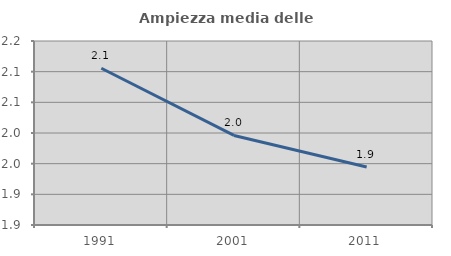
| Category | Ampiezza media delle famiglie |
|---|---|
| 1991.0 | 2.106 |
| 2001.0 | 1.996 |
| 2011.0 | 1.944 |